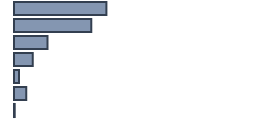
| Category | Percentatge |
|---|---|
| 0 | 38.5 |
| 1 | 32.2 |
| 2 | 14 |
| 3 | 7.8 |
| 4 | 2.1 |
| 5 | 5.1 |
| 6 | 0.299 |